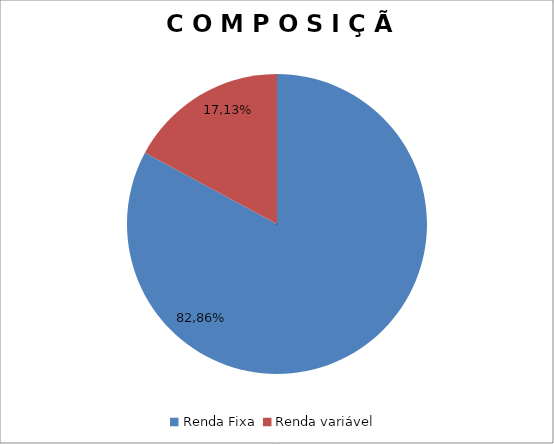
| Category | Series 0 |
|---|---|
| Renda Fixa  | 0.829 |
| Renda variável  | 0.171 |